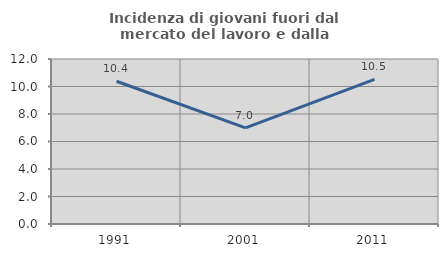
| Category | Incidenza di giovani fuori dal mercato del lavoro e dalla formazione  |
|---|---|
| 1991.0 | 10.384 |
| 2001.0 | 6.992 |
| 2011.0 | 10.522 |